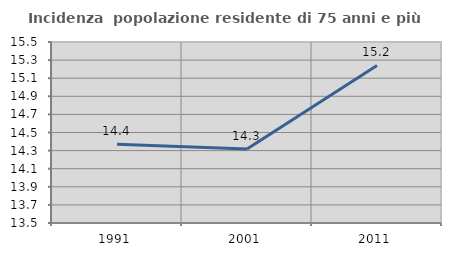
| Category | Incidenza  popolazione residente di 75 anni e più |
|---|---|
| 1991.0 | 14.369 |
| 2001.0 | 14.318 |
| 2011.0 | 15.241 |